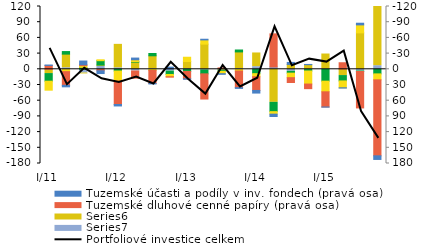
| Category | Series 6 | Series 5 | Zahraniční účasti a podíly v investičních fondech   | Zahraniční dluhové cenné papíry   |
|---|---|---|---|---|
| I/11 | 0.812 | 7.345 | 14.567 | 17.185 |
| II | -2.914 | -26.084 | -4.896 | 4.506 |
| III | 7.125 | 1.717 | -3.713 | -3.275 |
| IV | -5.325 | -2.798 | -8.33 | -1.701 |
| I/12 | -2.798 | -44.867 | 3.306 | 19.066 |
| II | 3.249 | -13.669 | -1.1 | -3.438 |
| III | -0.915 | -24.887 | -4.429 | 2.169 |
| IV | 3.402 | -0.733 | 6.453 | 4.343 |
| I/13 | -0.714 | -14.146 | 4.078 | -8.168 |
| II | 1.279 | -48.104 | 7.436 | -8.051 |
| III | -1.224 | 1.376 | 2.417 | 4.579 |
| IV | -1.402 | -31.82 | -3.652 | 3.278 |
| I/14 | -5.024 | -26.183 | 8.294 | 5.918 |
| II | -4.546 | 63.167 | 17.782 | 4.744 |
| III | 3.872 | -9.272 | 3.481 | 8.634 |
| IV | 0.485 | -8.788 | 2.772 | 24.934 |
| I/15 | -0.202 | -29.014 | 22.663 | 20.346 |
| II | -0.554 | 11.971 | 10.252 | 13.092 |
| III | 3.2 | -69.6 | 1.008 | -15.265 |
| IV | -6.9 | -145.2 | 8.766 | 11.368 |